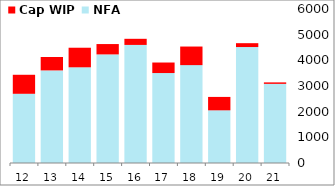
| Category | NFA | Cap WIP |
|---|---|---|
| 2012-03-31 | 2696.45 | 740.94 |
| 2013-03-31 | 3607.1 | 522.99 |
| 2014-03-31 | 3728.58 | 762.61 |
| 2015-03-31 | 4230.75 | 403.36 |
| 2016-03-31 | 4600.35 | 238.41 |
| 2017-03-31 | 3504.67 | 410.21 |
| 2018-03-31 | 3813.33 | 724.32 |
| 2019-03-31 | 2052.34 | 522.15 |
| 2020-03-31 | 4518.14 | 150.05 |
| 2021-03-31 | 3083.47 | 56.95 |